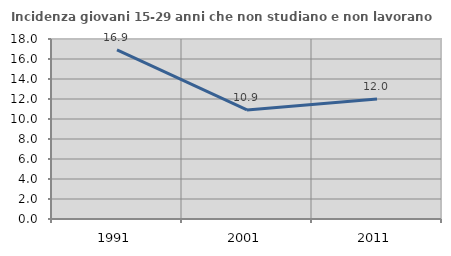
| Category | Incidenza giovani 15-29 anni che non studiano e non lavorano  |
|---|---|
| 1991.0 | 16.92 |
| 2001.0 | 10.905 |
| 2011.0 | 12.01 |